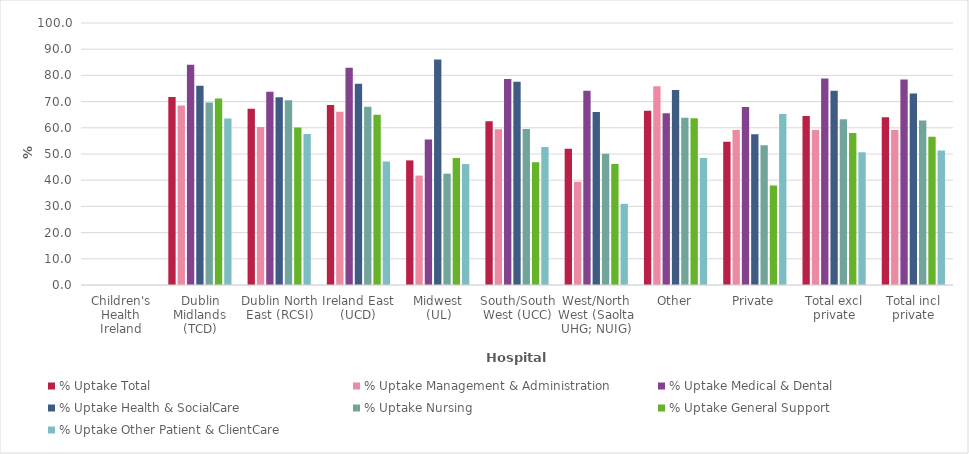
| Category | % Uptake Total  | % Uptake Management & Administration | % Uptake Medical & Dental | % Uptake Health & SocialCare | % Uptake Nursing | % Uptake General Support | % Uptake Other Patient & ClientCare |
|---|---|---|---|---|---|---|---|
| Children's Health Ireland | 0 | 0 | 0 | 0 | 0 | 0 | 0 |
| Dublin Midlands (TCD) | 71.787 | 68.481 | 84.067 | 76.076 | 69.656 | 71.192 | 63.52 |
| Dublin North East (RCSI) | 67.246 | 60.31 | 73.718 | 71.651 | 70.534 | 60.16 | 57.679 |
| Ireland East (UCD) | 68.678 | 66.141 | 82.891 | 76.844 | 68.046 | 64.937 | 47.095 |
| Midwest (UL) | 47.561 | 41.758 | 55.556 | 86.047 | 42.491 | 48.485 | 46.154 |
| South/South West (UCC) | 62.46 | 59.419 | 78.604 | 77.624 | 59.568 | 46.86 | 52.694 |
| West/North West (Saolta UHG; NUIG) | 52.003 | 39.449 | 74.158 | 66.068 | 50.105 | 46.181 | 30.963 |
| Other | 66.467 | 75.824 | 65.517 | 74.396 | 63.793 | 63.636 | 48.515 |
| Private | 54.642 | 59.149 | 67.91 | 57.537 | 53.315 | 37.963 | 65.232 |
| Total excl private | 64.508 | 59.178 | 78.772 | 74.113 | 63.238 | 58.012 | 50.677 |
| Total incl private | 64.05 | 59.176 | 78.462 | 73.138 | 62.83 | 56.598 | 51.368 |